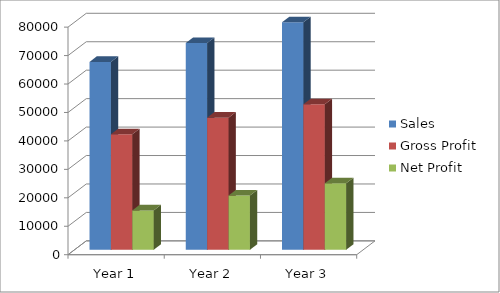
| Category | Sales | Gross Profit  | Net Profit |
|---|---|---|---|
| Year 1 | 66040 | 40576 | 13840 |
| Year 2 | 72648 | 46440 | 19080 |
| Year 3 | 79944 | 51120 | 23400 |